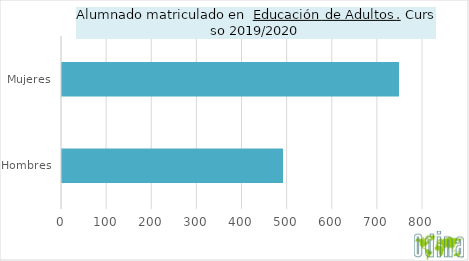
| Category | Series 0 |
|---|---|
| Hombres | 492 |
| Mujeres | 749 |